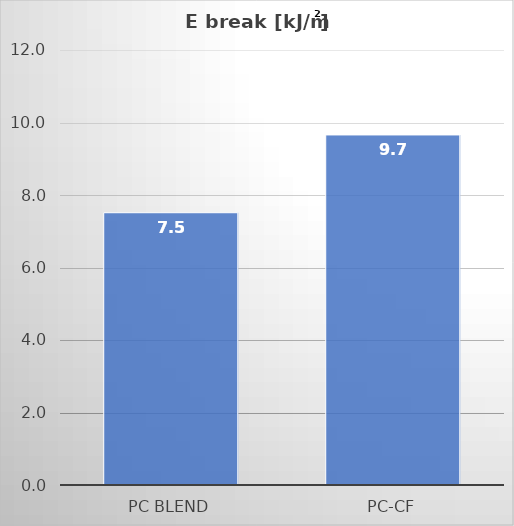
| Category | kJ/m² |
|---|---|
| PC blend | 7.511 |
| PC-CF | 9.657 |